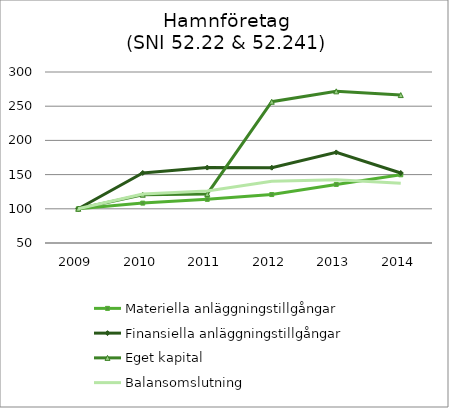
| Category | Materiella anläggningstillgångar | Finansiella anläggningstillgångar | Eget kapital | Balansomslutning |
|---|---|---|---|---|
| 2009.0 | 100 | 100 | 100 | 100 |
| 2010.0 | 108.319 | 152.345 | 120.573 | 121.695 |
| 2011.0 | 113.809 | 160.263 | 121.754 | 125.998 |
| 2012.0 | 120.818 | 160.111 | 256.51 | 140.338 |
| 2013.0 | 135.635 | 182.434 | 271.721 | 142.646 |
| 2014.0 | 149.723 | 152.347 | 266.255 | 137.497 |